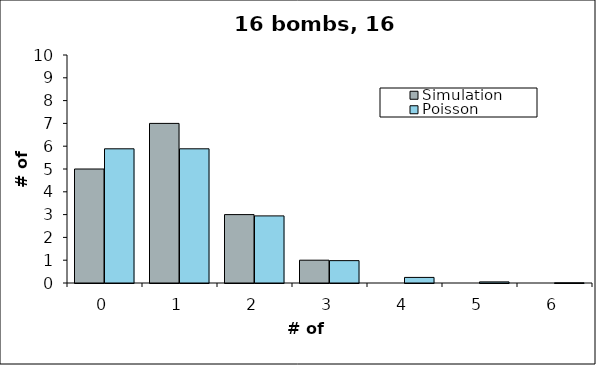
| Category | Simulation | Poisson |
|---|---|---|
| 0.0 | 5 | 5.886 |
| 1.0 | 7 | 5.886 |
| 2.0 | 3 | 2.943 |
| 3.0 | 1 | 0.981 |
| 4.0 | 0 | 0.245 |
| 5.0 | 0 | 0.049 |
| 6.0 | 0 | 0.008 |